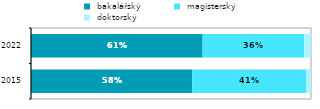
| Category |  bakalářský |  magisterský |  doktorský |
|---|---|---|---|
| 2015.0 | 0.576 | 0.408 | 0.016 |
| 2022.0 | 0.613 | 0.363 | 0.024 |